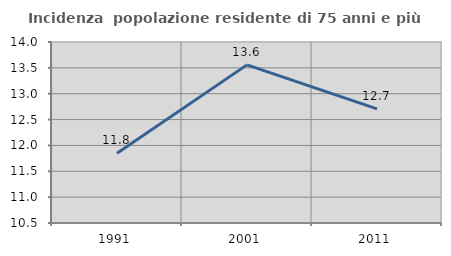
| Category | Incidenza  popolazione residente di 75 anni e più |
|---|---|
| 1991.0 | 11.848 |
| 2001.0 | 13.558 |
| 2011.0 | 12.708 |